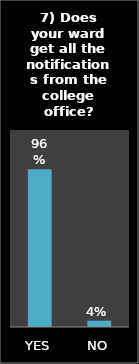
| Category | Series 0 |
|---|---|
| YES | 0.962 |
| NO | 0.038 |